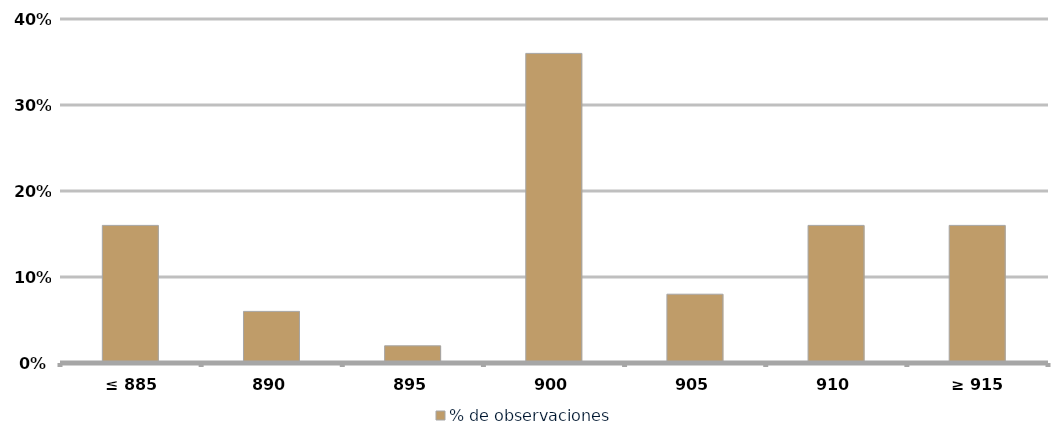
| Category | % de observaciones  |
|---|---|
|  ≤ 885  | 0.16 |
|  890  | 0.06 |
|  895  | 0.02 |
|  900  | 0.36 |
|  905  | 0.08 |
| 910 | 0.16 |
|  ≥ 915  | 0.16 |